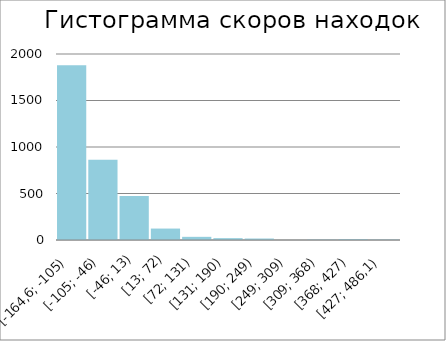
| Category | Series 0 |
|---|---|
| [-164,6; -105) | 1880 |
| [-105; -46) | 864 |
| [-46; 13) | 473 |
| [13; 72) | 123 |
| [72; 131) | 34 |
| [131; 190) | 20 |
| [190; 249) | 16 |
| [249; 309) | 1 |
| [309; 368) | 5 |
| [368; 427) | 9 |
| [427; 486,1) | 5 |